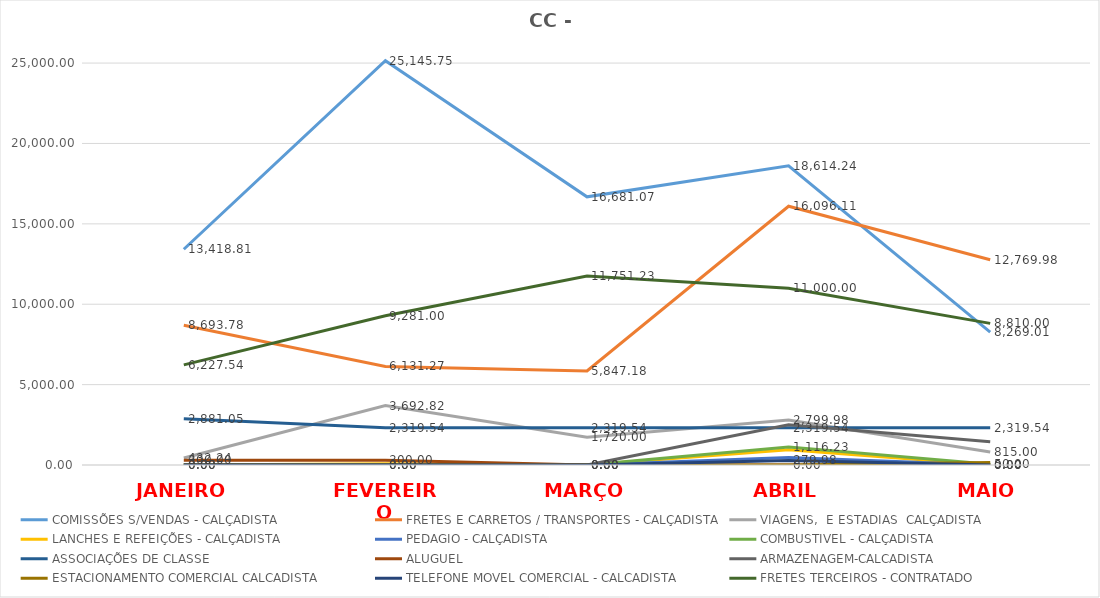
| Category | COMISSÕES S/VENDAS - CALÇADISTA | FRETES E CARRETOS / TRANSPORTES - CALÇADISTA | VIAGENS,  E ESTADIAS  CALÇADISTA | LANCHES E REFEIÇÕES - CALÇADISTA | PEDAGIO - CALÇADISTA | COMBUSTIVEL - CALÇADISTA | ASSOCIAÇÕES DE CLASSE | ALUGUEL | ARMAZENAGEM-CALCADISTA | ESTACIONAMENTO COMERCIAL CALCADISTA | TELEFONE MOVEL COMERCIAL - CALCADISTA | FRETES TERCEIROS - CONTRATADO |
|---|---|---|---|---|---|---|---|---|---|---|---|---|
| JANEIRO | 13418.81 | 8693.78 | 432.24 | 0 | 0 | 0 | 2881.05 | 300 | 0 | 0 | 0 | 6227.54 |
| FEVEREIRO | 25145.75 | 6131.27 | 3692.82 | 83.49 | 0 | 0 | 2319.54 | 300 | 0 | 0 | 0 | 9281 |
| MARÇO | 16681.07 | 5847.18 | 1720 | 0 | 0 | 0 | 2319.54 | 0 | 0 | 0 | 0 | 11751.23 |
| ABRIL | 18614.24 | 16096.11 | 2799.98 | 953.61 | 461.2 | 1116.23 | 2319.54 | 0 | 2496.42 | 3 | 279.98 | 11000 |
| MAIO | 8269.01 | 12769.98 | 815 | 0 | 0 | 50 | 2319.54 | 0 | 1447.92 | 162 | 0 | 8810 |